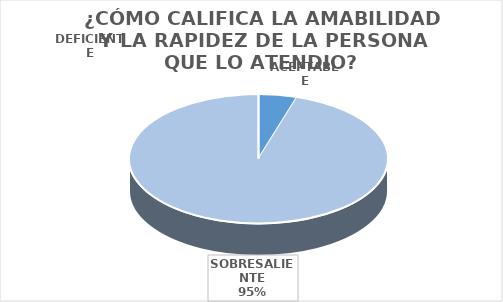
| Category | Series 0 |
|---|---|
| DEFICIENTE | 0 |
| ACEPTABLE | 8 |
| SOBRESALIENTE | 158 |